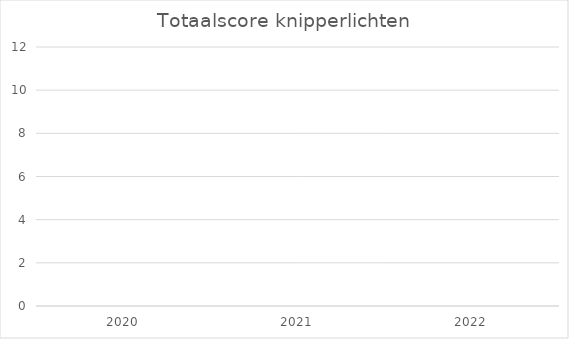
| Category | Totaalscore knipperlichten |
|---|---|
| 2020.0 | 0 |
| 2021.0 | 0 |
| 2022.0 | 0 |